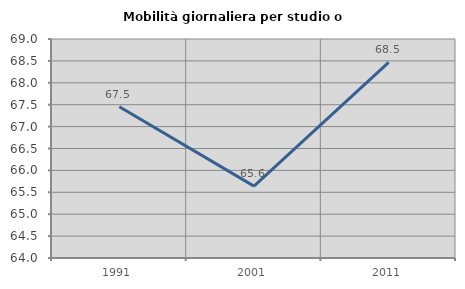
| Category | Mobilità giornaliera per studio o lavoro |
|---|---|
| 1991.0 | 67.454 |
| 2001.0 | 65.642 |
| 2011.0 | 68.464 |